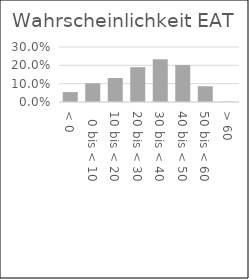
| Category | Wahrsch. |
|---|---|
| < 0 | 0.054 |
|   0 bis < 10 | 0.102 |
| 10 bis < 20 | 0.131 |
| 20 bis < 30 | 0.19 |
| 30 bis < 40 | 0.233 |
| 40 bis < 50 | 0.202 |
| 50 bis < 60 | 0.086 |
| > 60 | 0.002 |